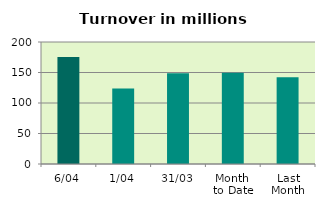
| Category | Series 0 |
|---|---|
| 6/04 | 175.437 |
| 1/04 | 123.609 |
| 31/03 | 148.61 |
| Month 
to Date | 149.523 |
| Last
Month | 142.086 |